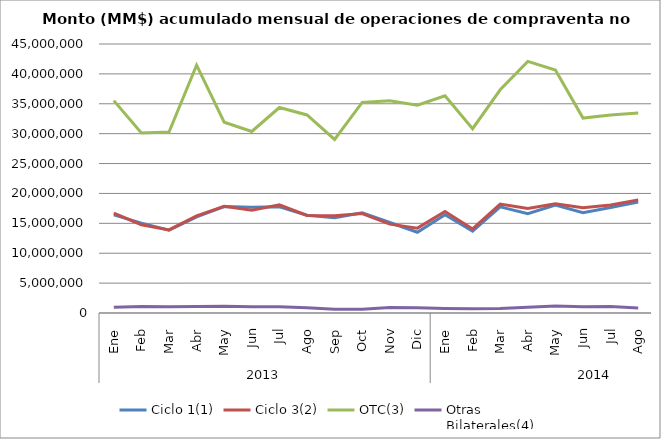
| Category | Ciclo 1(1) | Ciclo 3(2) | OTC(3) | Otras
Bilaterales(4) |
|---|---|---|---|---|
| 0 | 16417241.727 | 16700335.202 | 35523809.408 | 972958.086 |
| 1 | 15037741.172 | 14773657.586 | 30102338.851 | 1073496.596 |
| 2 | 13848943.779 | 13900402.205 | 30273669.122 | 1026617.054 |
| 3 | 16086096.035 | 16245696.168 | 41465554.082 | 1105720.368 |
| 4 | 17801790.619 | 17838763.351 | 31909646.654 | 1133512.85 |
| 5 | 17684542.956 | 17179330.609 | 30372188.279 | 1025162.543 |
| 6 | 17771623.451 | 18089502.524 | 34376831.202 | 1053340.718 |
| 7 | 16359818.954 | 16327115.519 | 33128143.288 | 882723.558 |
| 8 | 15949862.744 | 16281684.387 | 29025705.039 | 624893.462 |
| 9 | 16760948.703 | 16634867.291 | 35234004.542 | 641647.876 |
| 10 | 15133528.556 | 14863555.208 | 35512550.02 | 915020.525 |
| 11 | 13509827.678 | 14192849.668 | 34769513.126 | 877765.247 |
| 12 | 16434121.823 | 16973216.875 | 36341658.718 | 750147.378 |
| 13 | 13675521.943 | 14060199.134 | 30828680.35 | 721919.806 |
| 14 | 17760484.117 | 18231676.991 | 37344676.439 | 768460.999 |
| 15 | 16615436.994 | 17468955.339 | 42094978.158 | 945494.284 |
| 16 | 18046213.572 | 18258193.447 | 40638812.154 | 1185202.419 |
| 17 | 16777760.924 | 17604169.829 | 32614242.011 | 1051618.708 |
| 18 | 17653207.737 | 18067976.125 | 33107498.911 | 1069963.521 |
| 19 | 18582577.233 | 18927801.519 | 33476806.263 | 855141.972 |